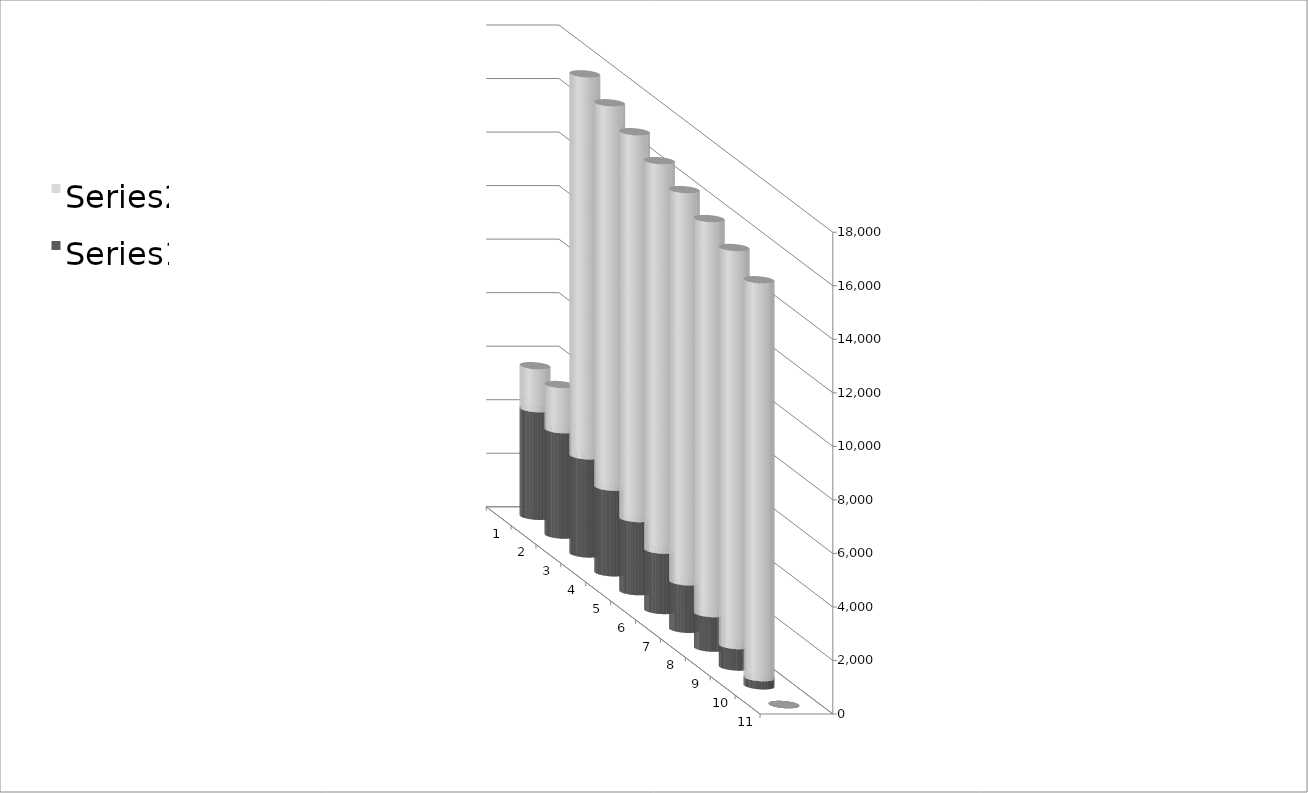
| Category | Series 0 | Series 1 | Zins | Tilg. |
|---|---|---|---|---|
| 0 | 4020 | 1600 |  |  |
| 1 | 3940 | 1680 |  |  |
| 2 | 3667.25 | 14264 |  |  |
| 3 | 3201.55 | 14352.2 |  |  |
| 4 | 2731.44 | 14444.81 |  |  |
| 5 | 2256.699 | 14542.05 |  |  |
| 6 | 1777.097 | 14644.153 |  |  |
| 7 | 1292.389 | 14751.361 |  |  |
| 8 | 802.321 | 14863.929 |  |  |
| 9 | 306.625 | 14857.497 |  |  |
| 10 | 0 | 0 |  |  |